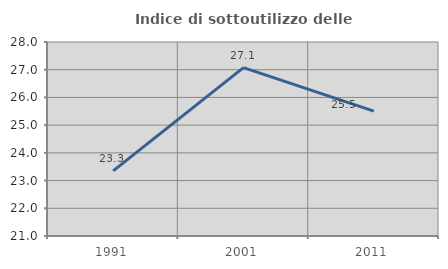
| Category | Indice di sottoutilizzo delle abitazioni  |
|---|---|
| 1991.0 | 23.348 |
| 2001.0 | 27.075 |
| 2011.0 | 25.507 |